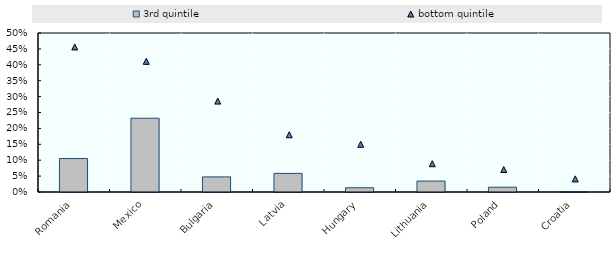
| Category | 3rd quintile |
|---|---|
| Romania | 0.105 |
| Mexico | 0.232 |
| Bulgaria | 0.047 |
| Latvia | 0.059 |
| Hungary | 0.013 |
| Lithuania | 0.034 |
| Poland | 0.015 |
| Croatia | 0.001 |